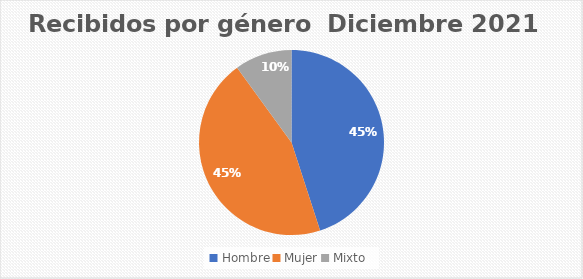
| Category | Recibidos por género  Diciembre |
|---|---|
| Hombre | 18 |
| Mujer | 18 |
| Mixto | 4 |